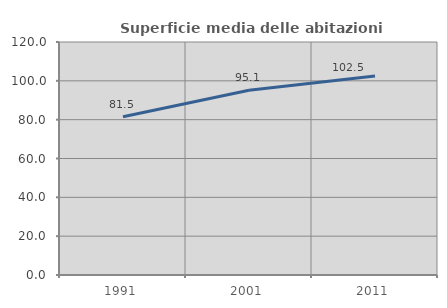
| Category | Superficie media delle abitazioni occupate |
|---|---|
| 1991.0 | 81.529 |
| 2001.0 | 95.15 |
| 2011.0 | 102.502 |